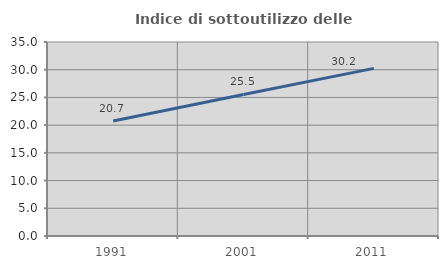
| Category | Indice di sottoutilizzo delle abitazioni  |
|---|---|
| 1991.0 | 20.747 |
| 2001.0 | 25.536 |
| 2011.0 | 30.244 |